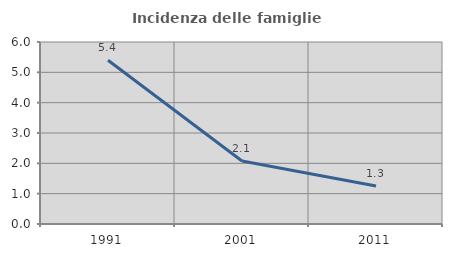
| Category | Incidenza delle famiglie numerose |
|---|---|
| 1991.0 | 5.398 |
| 2001.0 | 2.079 |
| 2011.0 | 1.25 |